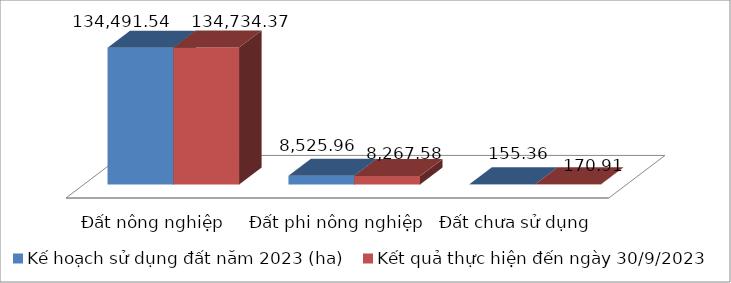
| Category | Kế hoạch sử dụng đất năm 2023 (ha) | Kết quả thực hiện đến ngày 30/9/2023 |
|---|---|---|
| Đất nông nghiệp | 134491.54 | 134734.37 |
| Đất phi nông nghiệp | 8525.96 | 8267.58 |
| Đất chưa sử dụng | 155.36 | 170.91 |